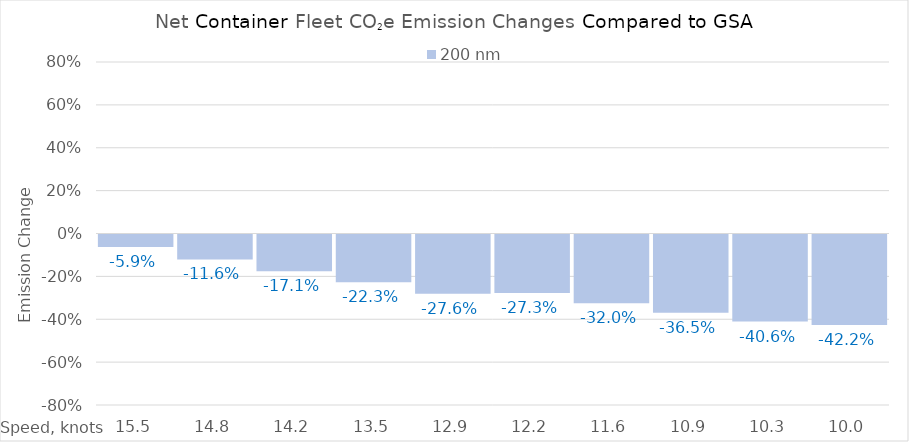
| Category | 200 |
|---|---|
| 15.450000000000001 | -0.059 |
| 14.8 | -0.116 |
| 14.15 | -0.171 |
| 13.5 | -0.223 |
| 12.85 | -0.276 |
| 12.2 | -0.273 |
| 11.549999999999999 | -0.32 |
| 10.899999999999999 | -0.365 |
| 10.249999999999998 | -0.406 |
| 10.0 | -0.422 |